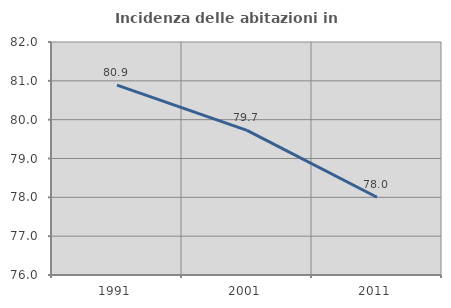
| Category | Incidenza delle abitazioni in proprietà  |
|---|---|
| 1991.0 | 80.89 |
| 2001.0 | 79.723 |
| 2011.0 | 78.002 |